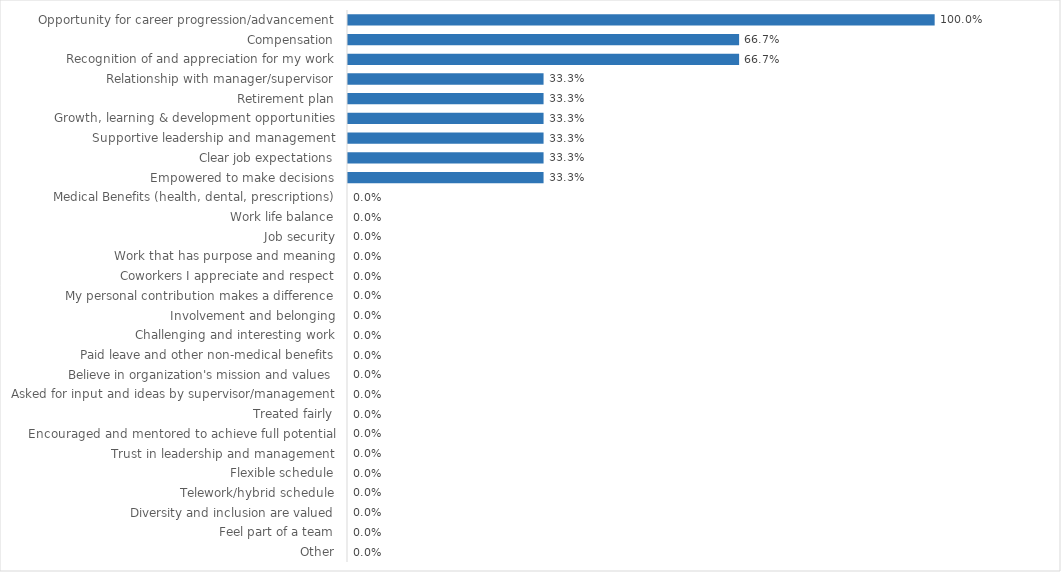
| Category | Criminal Justice Council |
|---|---|
| Opportunity for career progression/advancement | 1 |
| Compensation | 0.667 |
| Recognition of and appreciation for my work | 0.667 |
| Relationship with manager/supervisor | 0.333 |
| Retirement plan | 0.333 |
| Growth, learning & development opportunities | 0.333 |
| Supportive leadership and management | 0.333 |
| Clear job expectations | 0.333 |
| Empowered to make decisions | 0.333 |
| Medical Benefits (health, dental, prescriptions) | 0 |
| Work life balance | 0 |
| Job security | 0 |
| Work that has purpose and meaning | 0 |
| Coworkers I appreciate and respect | 0 |
| My personal contribution makes a difference | 0 |
| Involvement and belonging | 0 |
| Challenging and interesting work | 0 |
| Paid leave and other non-medical benefits | 0 |
| Believe in organization's mission and values | 0 |
| Asked for input and ideas by supervisor/management | 0 |
| Treated fairly | 0 |
| Encouraged and mentored to achieve full potential | 0 |
| Trust in leadership and management | 0 |
| Flexible schedule | 0 |
| Telework/hybrid schedule | 0 |
| Diversity and inclusion are valued | 0 |
| Feel part of a team | 0 |
| Other | 0 |